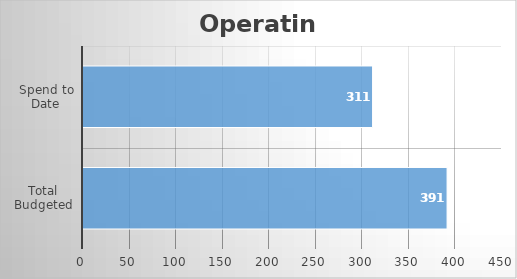
| Category | Operating |
|---|---|
| Total Budgeted | 391 |
| Spend to Date | 311 |